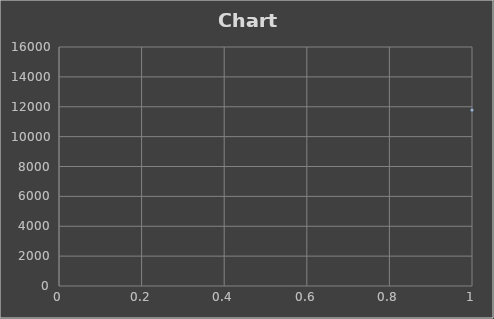
| Category | Series 0 |
|---|---|
| 0 | 11776 |
| 1 | 8746 |
| 2 | 6166 |
| 3 | 4036 |
| 4 | 2356 |
| 5 | 1126 |
| 6 | 346 |
| 7 | 16 |
| 8 | 136 |
| 9 | 706 |
| 10 | 1726 |
| 11 | 3196 |
| 12 | 5116 |
| 13 | 7486 |
| 14 | 10306 |
| 15 | 13576 |